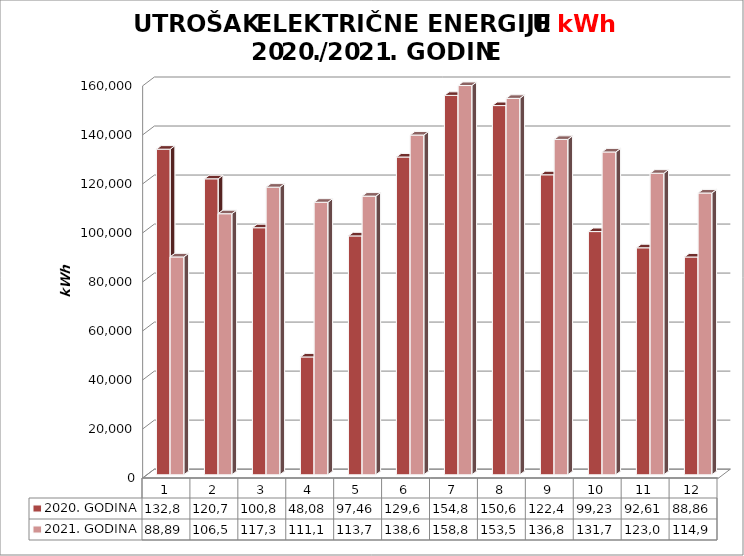
| Category | 2020. GODINA | 2021. GODINA |
|---|---|---|
| 0 | 132855 | 88892 |
| 1 | 120765 | 106520 |
| 2 | 100804 | 117357 |
| 3 | 48084 | 111199 |
| 4 | 97467 | 113700 |
| 5 | 129659 | 138631 |
| 6 | 154805 | 158827 |
| 7 | 150645 | 153588 |
| 8 | 122408 | 136846 |
| 9 | 99238 | 131726 |
| 10 | 92615 | 123040 |
| 11 | 88861 | 114977 |